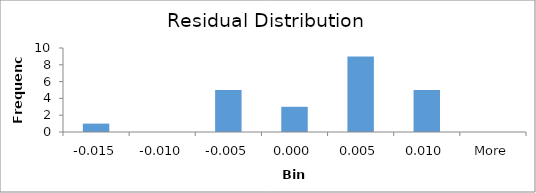
| Category | Frequency |
|---|---|
| -0.015 | 1 |
| -0.010 | 0 |
| -0.005 | 5 |
| 0.000 | 3 |
| 0.005 | 9 |
| 0.010 | 5 |
| More | 0 |